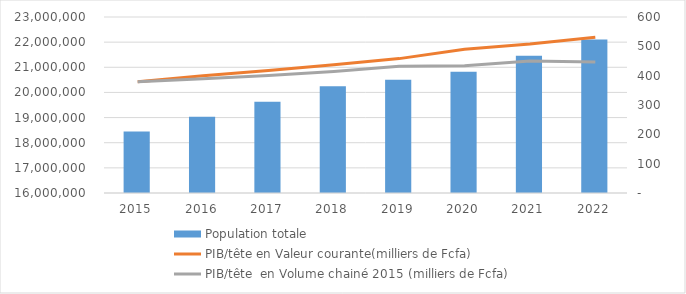
| Category | Population totale |
|---|---|
| 2015.0 | 18450494 |
| 2016.0 | 19034397 |
| 2017.0 | 19632147 |
| 2018.0 | 20244080 |
| 2019.0 | 20505155 |
| 2020.0 | 20818036 |
| 2021.0 | 21455644 |
| 2022.0 | 22100874 |